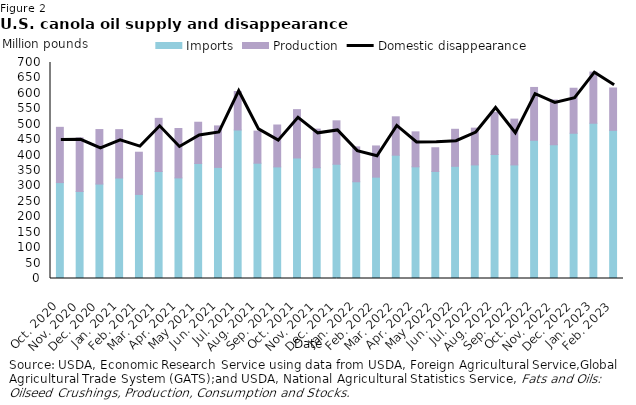
| Category | Imports | Production |
|---|---|---|
| Oct. 2020 | 310.863 | 179.038 |
| Nov. 2020 | 282.065 | 173.513 |
| Dec. 2020 | 306.054 | 176.692 |
| Jan. 2021 | 325.628 | 156.818 |
| Feb. 2021 | 272.475 | 136.767 |
| Mar. 2021 | 346.777 | 172.196 |
| Apr. 2021 | 326.029 | 160.03 |
| May 2021 | 372.653 | 133.761 |
| Jun. 2021 | 359.99 | 134.531 |
| Jul. 2021 | 481.33 | 124.634 |
| Aug. 2021 | 373.694 | 103.99 |
| Sep. 2021 | 361.623 | 135.812 |
| Oct. 2021 | 390.613 | 156.615 |
| Nov. 2021 | 358.958 | 125.126 |
| Dec. 2021 | 370.307 | 140.696 |
| Jan. 2022 | 313.49 | 113.003 |
| Feb. 2022 | 328.484 | 101.075 |
| Mar. 2022 | 399.579 | 124.427 |
| Apr. 2022 | 361.95 | 113.295 |
| May 2022 | 346.913 | 76.861 |
| Jun. 2022 | 363.579 | 119.992 |
| Jul. 2022 | 368.116 | 119.152 |
| Aug. 2022 | 401.902 | 136.548 |
| Sep. 2022 | 368.094 | 148.457 |
| Oct. 2022 | 447.873 | 171.282 |
| Nov. 2022 | 433.458 | 144.969 |
| Dec. 2022 | 470.654 | 145.914 |
| Jan. 2023 | 503.167 | 165.781 |
| Feb. 2023 | 480.094 | 137.282 |